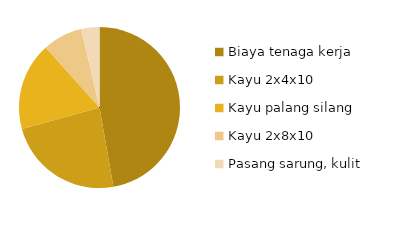
| Category | Series 0 |
|---|---|
| Biaya tenaga kerja | 200 |
| Kayu 2x4x10 | 99.4 |
| Kayu palang silang | 74.7 |
| Kayu 2x8x10 | 33.75 |
| Pasang sarung, kulit | 15.5 |